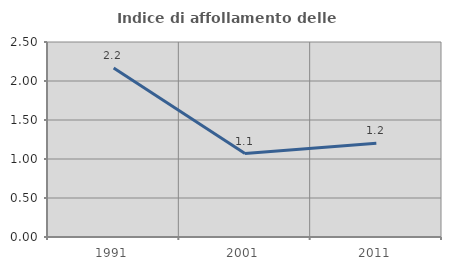
| Category | Indice di affollamento delle abitazioni  |
|---|---|
| 1991.0 | 2.166 |
| 2001.0 | 1.07 |
| 2011.0 | 1.201 |